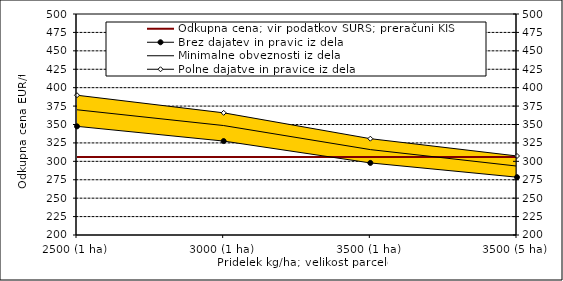
| Category | Odkupna cena; vir podatkov SURS; preračuni KIS |
|---|---|
| 2500 (1 ha) | 306 |
| 3000 (1 ha) | 306 |
| 3500 (1 ha) | 306 |
| 3500 (5 ha) | 306 |